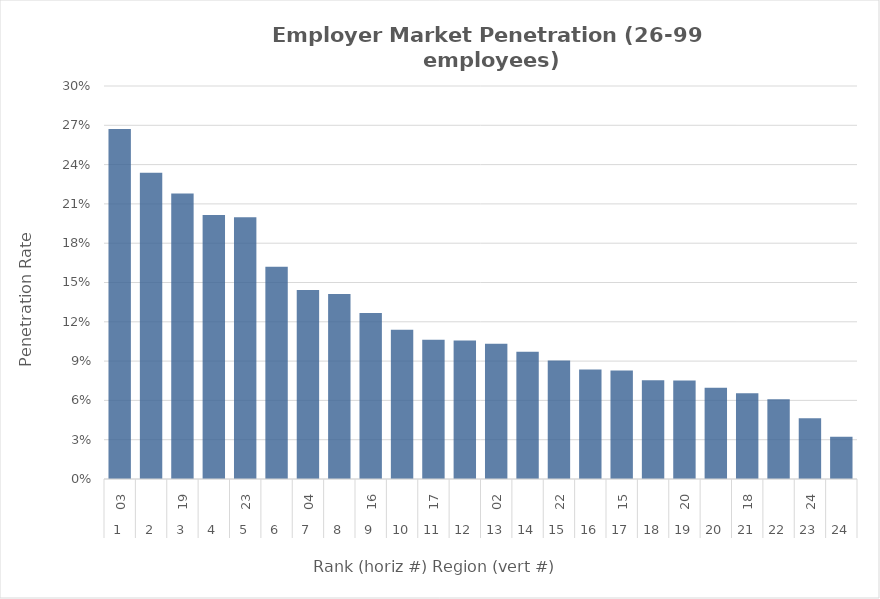
| Category | Rate |
|---|---|
| 0 | 0.267 |
| 1 | 0.234 |
| 2 | 0.218 |
| 3 | 0.201 |
| 4 | 0.2 |
| 5 | 0.162 |
| 6 | 0.144 |
| 7 | 0.141 |
| 8 | 0.127 |
| 9 | 0.114 |
| 10 | 0.106 |
| 11 | 0.106 |
| 12 | 0.103 |
| 13 | 0.097 |
| 14 | 0.091 |
| 15 | 0.083 |
| 16 | 0.083 |
| 17 | 0.075 |
| 18 | 0.075 |
| 19 | 0.07 |
| 20 | 0.065 |
| 21 | 0.061 |
| 22 | 0.046 |
| 23 | 0.032 |